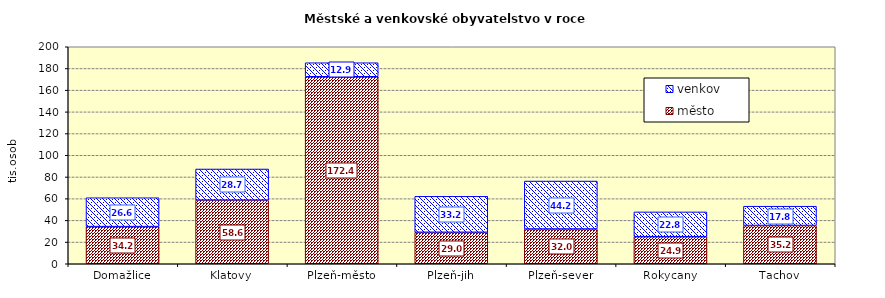
| Category | město | venkov |
|---|---|---|
| Domažlice | 34227 | 26631 |
| Klatovy | 58649 | 28691 |
| Plzeň-město | 172360 | 12915 |
| Plzeň-jih | 28984 | 33179 |
| Plzeň-sever | 32024 | 44208 |
| Rokycany | 24921 | 22849 |
| Tachov | 35237 | 17812 |